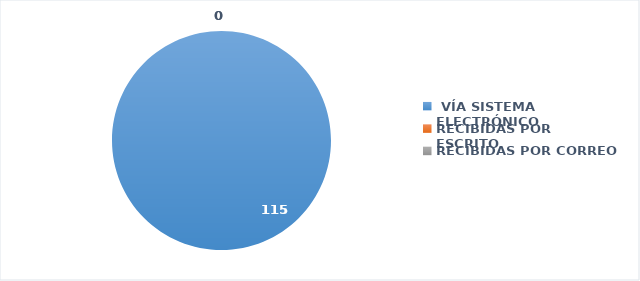
| Category | SOLICITUDES RECIBIDAS |
|---|---|
|  VÍA SISTEMA ELECTRÓNICO | 115 |
| RECIBIDAS POR ESCRITO | 0 |
| RECIBIDAS POR CORREO | 0 |